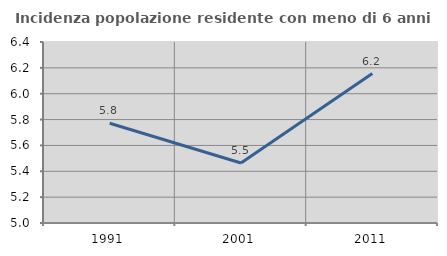
| Category | Incidenza popolazione residente con meno di 6 anni |
|---|---|
| 1991.0 | 5.772 |
| 2001.0 | 5.464 |
| 2011.0 | 6.156 |